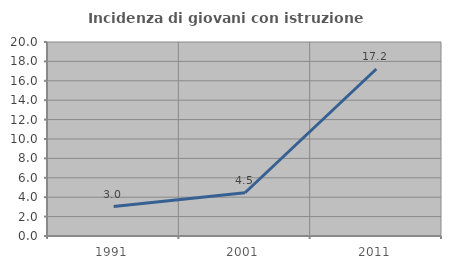
| Category | Incidenza di giovani con istruzione universitaria |
|---|---|
| 1991.0 | 3.03 |
| 2001.0 | 4.459 |
| 2011.0 | 17.213 |